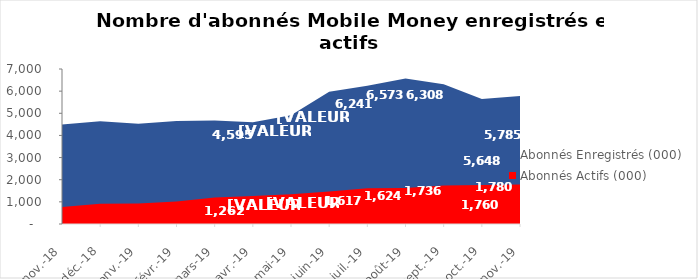
| Category | Abonnés Enregistrés (000) | Abonnés Actifs (000) |
|---|---|---|
| 2018-11-01 | 4493.34 | 766.339 |
| 2018-12-01 | 4644.562 | 911.789 |
| 2019-01-01 | 4527.359 | 930.174 |
| 2019-02-01 | 4647.251 | 1020.836 |
| 2019-03-01 | 4674.727 | 1191.865 |
| 2019-04-01 | 4594.933 | 1262.375 |
| 2019-05-01 | 4906.39 | 1348.464 |
| 2019-06-01 | 5970.219 | 1469.506 |
| 2019-07-01 | 6241.321 | 1617.302 |
| 2019-08-01 | 6573.217 | 1623.629 |
| 2019-09-01 | 6308.141 | 1736.322 |
| 2019-10-01 | 5647.98 | 1759.726 |
| 2019-11-01 | 5785.328 | 1779.8 |